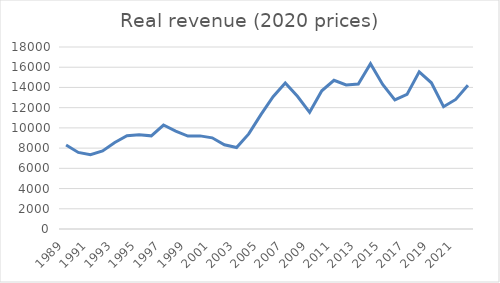
| Category | Real revenue (2020 prices) |
|---|---|
| 1989.0 | 8302.369 |
| 1990.0 | 7571.228 |
| 1991.0 | 7345.142 |
| 1992.0 | 7723.031 |
| 1993.0 | 8554.618 |
| 1994.0 | 9226.148 |
| 1995.0 | 9329.28 |
| 1996.0 | 9212.017 |
| 1997.0 | 10282.762 |
| 1998.0 | 9673.76 |
| 1999.0 | 9189.989 |
| 2000.0 | 9208.986 |
| 2001.0 | 9018.074 |
| 2002.0 | 8323.879 |
| 2003.0 | 8058.951 |
| 2004.0 | 9404.085 |
| 2005.0 | 11310.654 |
| 2006.0 | 13091.461 |
| 2007.0 | 14447.043 |
| 2008.0 | 13121.771 |
| 2009.0 | 11541.078 |
| 2010.0 | 13667.891 |
| 2011.0 | 14708.54 |
| 2012.0 | 14242.558 |
| 2013.0 | 14343.846 |
| 2014.0 | 16355.47 |
| 2015.0 | 14296.912 |
| 2016.0 | 12768.854 |
| 2017.0 | 13315.788 |
| 2018.0 | 15543.021 |
| 2019.0 | 14460.288 |
| 2020.0 | 12093.3 |
| 2021.0 | 12815.839 |
| 2022.0 | 14207.463 |